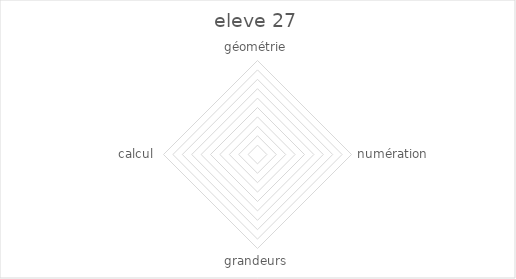
| Category | eleve |
|---|---|
| géométrie | 0 |
| numération | 0 |
| grandeurs | 0 |
| calcul | 0 |